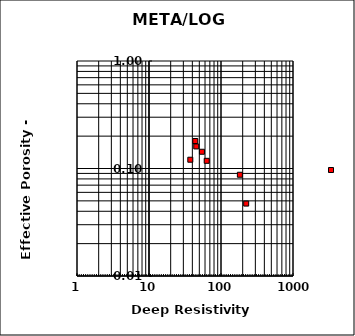
| Category | Series 0 |
|---|---|
| 182.9 | 0.087 |
| 223.775 | 0.047 |
| 63.32 | 0.118 |
| 54.3666666666667 | 0.143 |
| 43.9333333333333 | 0.18 |
| 45.3 | 0.16 |
| 37.4666666666667 | 0.121 |